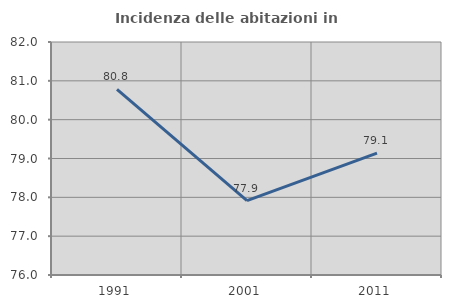
| Category | Incidenza delle abitazioni in proprietà  |
|---|---|
| 1991.0 | 80.782 |
| 2001.0 | 77.913 |
| 2011.0 | 79.138 |